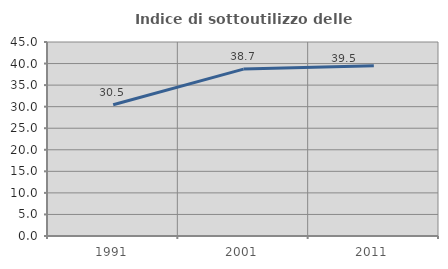
| Category | Indice di sottoutilizzo delle abitazioni  |
|---|---|
| 1991.0 | 30.455 |
| 2001.0 | 38.714 |
| 2011.0 | 39.486 |